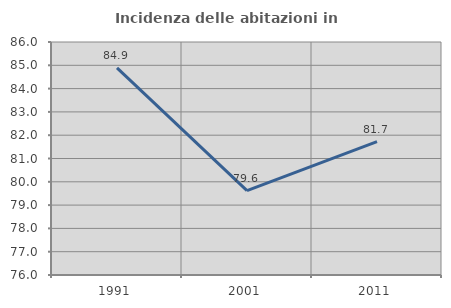
| Category | Incidenza delle abitazioni in proprietà  |
|---|---|
| 1991.0 | 84.887 |
| 2001.0 | 79.62 |
| 2011.0 | 81.728 |